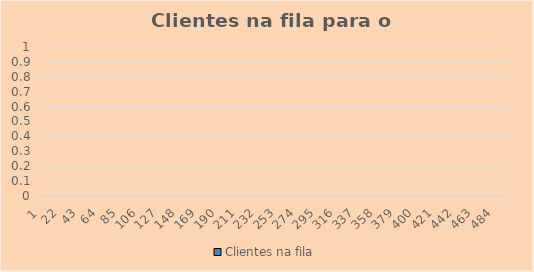
| Category | Clientes na fila |
|---|---|
| 1.0 | 0 |
| 2.0 | 0 |
| 3.0 | 0 |
| 4.0 | 0 |
| 5.0 | 0 |
| 6.0 | 0 |
| 7.0 | 0 |
| 8.0 | 0 |
| 9.0 | 0 |
| 10.0 | 0 |
| 11.0 | 0 |
| 12.0 | 0 |
| 13.0 | 0 |
| 14.0 | 0 |
| 15.0 | 0 |
| 16.0 | 0 |
| 17.0 | 0 |
| 18.0 | 0 |
| 19.0 | 0 |
| 20.0 | 0 |
| 21.0 | 0 |
| 22.0 | 0 |
| 23.0 | 0 |
| 24.0 | 0 |
| 25.0 | 0 |
| 26.0 | 0 |
| 27.0 | 0 |
| 28.0 | 0 |
| 29.0 | 0 |
| 30.0 | 0 |
| 31.0 | 0 |
| 32.0 | 0 |
| 33.0 | 0 |
| 34.0 | 0 |
| 35.0 | 0 |
| 36.0 | 0 |
| 37.0 | 0 |
| 38.0 | 0 |
| 39.0 | 0 |
| 40.0 | 0 |
| 41.0 | 0 |
| 42.0 | 0 |
| 43.0 | 0 |
| 44.0 | 0 |
| 45.0 | 0 |
| 46.0 | 0 |
| 47.0 | 0 |
| 48.0 | 0 |
| 49.0 | 0 |
| 50.0 | 0 |
| 51.0 | 0 |
| 52.0 | 0 |
| 53.0 | 0 |
| 54.0 | 0 |
| 55.0 | 0 |
| 56.0 | 0 |
| 57.0 | 0 |
| 58.0 | 0 |
| 59.0 | 0 |
| 60.0 | 0 |
| 61.0 | 0 |
| 62.0 | 0 |
| 63.0 | 0 |
| 64.0 | 0 |
| 65.0 | 0 |
| 66.0 | 0 |
| 67.0 | 0 |
| 68.0 | 0 |
| 69.0 | 0 |
| 70.0 | 0 |
| 71.0 | 0 |
| 72.0 | 0 |
| 73.0 | 0 |
| 74.0 | 0 |
| 75.0 | 0 |
| 76.0 | 0 |
| 77.0 | 0 |
| 78.0 | 0 |
| 79.0 | 0 |
| 80.0 | 0 |
| 81.0 | 0 |
| 82.0 | 0 |
| 83.0 | 0 |
| 84.0 | 0 |
| 85.0 | 0 |
| 86.0 | 0 |
| 87.0 | 0 |
| 88.0 | 0 |
| 89.0 | 0 |
| 90.0 | 0 |
| 91.0 | 0 |
| 92.0 | 0 |
| 93.0 | 0 |
| 94.0 | 0 |
| 95.0 | 0 |
| 96.0 | 0 |
| 97.0 | 0 |
| 98.0 | 0 |
| 99.0 | 0 |
| 100.0 | 0 |
| 101.0 | 0 |
| 102.0 | 0 |
| 103.0 | 0 |
| 104.0 | 0 |
| 105.0 | 0 |
| 106.0 | 0 |
| 107.0 | 0 |
| 108.0 | 0 |
| 109.0 | 0 |
| 110.0 | 0 |
| 111.0 | 0 |
| 112.0 | 0 |
| 113.0 | 0 |
| 114.0 | 0 |
| 115.0 | 0 |
| 116.0 | 0 |
| 117.0 | 0 |
| 118.0 | 0 |
| 119.0 | 0 |
| 120.0 | 0 |
| 121.0 | 0 |
| 122.0 | 0 |
| 123.0 | 0 |
| 124.0 | 0 |
| 125.0 | 0 |
| 126.0 | 0 |
| 127.0 | 0 |
| 128.0 | 0 |
| 129.0 | 0 |
| 130.0 | 0 |
| 131.0 | 0 |
| 132.0 | 0 |
| 133.0 | 0 |
| 134.0 | 0 |
| 135.0 | 0 |
| 136.0 | 0 |
| 137.0 | 0 |
| 138.0 | 0 |
| 139.0 | 0 |
| 140.0 | 0 |
| 141.0 | 0 |
| 142.0 | 0 |
| 143.0 | 0 |
| 144.0 | 0 |
| 145.0 | 0 |
| 146.0 | 0 |
| 147.0 | 0 |
| 148.0 | 0 |
| 149.0 | 0 |
| 150.0 | 0 |
| 151.0 | 0 |
| 152.0 | 0 |
| 153.0 | 0 |
| 154.0 | 0 |
| 155.0 | 0 |
| 156.0 | 0 |
| 157.0 | 0 |
| 158.0 | 0 |
| 159.0 | 0 |
| 160.0 | 0 |
| 161.0 | 0 |
| 162.0 | 0 |
| 163.0 | 0 |
| 164.0 | 0 |
| 165.0 | 0 |
| 166.0 | 0 |
| 167.0 | 0 |
| 168.0 | 0 |
| 169.0 | 0 |
| 170.0 | 0 |
| 171.0 | 0 |
| 172.0 | 0 |
| 173.0 | 0 |
| 174.0 | 0 |
| 175.0 | 0 |
| 176.0 | 0 |
| 177.0 | 0 |
| 178.0 | 0 |
| 179.0 | 0 |
| 180.0 | 0 |
| 181.0 | 0 |
| 182.0 | 0 |
| 183.0 | 0 |
| 184.0 | 0 |
| 185.0 | 0 |
| 186.0 | 0 |
| 187.0 | 0 |
| 188.0 | 0 |
| 189.0 | 0 |
| 190.0 | 0 |
| 191.0 | 0 |
| 192.0 | 0 |
| 193.0 | 0 |
| 194.0 | 0 |
| 195.0 | 0 |
| 196.0 | 0 |
| 197.0 | 0 |
| 198.0 | 0 |
| 199.0 | 0 |
| 200.0 | 0 |
| 201.0 | 0 |
| 202.0 | 0 |
| 203.0 | 0 |
| 204.0 | 0 |
| 205.0 | 0 |
| 206.0 | 0 |
| 207.0 | 0 |
| 208.0 | 0 |
| 209.0 | 0 |
| 210.0 | 0 |
| 211.0 | 0 |
| 212.0 | 0 |
| 213.0 | 0 |
| 214.0 | 0 |
| 215.0 | 0 |
| 216.0 | 0 |
| 217.0 | 0 |
| 218.0 | 0 |
| 219.0 | 0 |
| 220.0 | 0 |
| 221.0 | 0 |
| 222.0 | 0 |
| 223.0 | 0 |
| 224.0 | 0 |
| 225.0 | 0 |
| 226.0 | 0 |
| 227.0 | 0 |
| 228.0 | 0 |
| 229.0 | 0 |
| 230.0 | 0 |
| 231.0 | 0 |
| 232.0 | 0 |
| 233.0 | 0 |
| 234.0 | 0 |
| 235.0 | 0 |
| 236.0 | 0 |
| 237.0 | 0 |
| 238.0 | 0 |
| 239.0 | 0 |
| 240.0 | 0 |
| 241.0 | 0 |
| 242.0 | 0 |
| 243.0 | 0 |
| 244.0 | 0 |
| 245.0 | 0 |
| 246.0 | 0 |
| 247.0 | 0 |
| 248.0 | 0 |
| 249.0 | 0 |
| 250.0 | 0 |
| 251.0 | 0 |
| 252.0 | 0 |
| 253.0 | 0 |
| 254.0 | 0 |
| 255.0 | 0 |
| 256.0 | 0 |
| 257.0 | 0 |
| 258.0 | 0 |
| 259.0 | 0 |
| 260.0 | 0 |
| 261.0 | 0 |
| 262.0 | 0 |
| 263.0 | 0 |
| 264.0 | 0 |
| 265.0 | 0 |
| 266.0 | 0 |
| 267.0 | 0 |
| 268.0 | 0 |
| 269.0 | 0 |
| 270.0 | 0 |
| 271.0 | 0 |
| 272.0 | 0 |
| 273.0 | 0 |
| 274.0 | 0 |
| 275.0 | 0 |
| 276.0 | 0 |
| 277.0 | 0 |
| 278.0 | 0 |
| 279.0 | 0 |
| 280.0 | 0 |
| 281.0 | 0 |
| 282.0 | 0 |
| 283.0 | 0 |
| 284.0 | 0 |
| 285.0 | 0 |
| 286.0 | 0 |
| 287.0 | 0 |
| 288.0 | 0 |
| 289.0 | 0 |
| 290.0 | 0 |
| 291.0 | 0 |
| 292.0 | 0 |
| 293.0 | 0 |
| 294.0 | 0 |
| 295.0 | 0 |
| 296.0 | 0 |
| 297.0 | 0 |
| 298.0 | 0 |
| 299.0 | 0 |
| 300.0 | 0 |
| 301.0 | 0 |
| 302.0 | 0 |
| 303.0 | 0 |
| 304.0 | 0 |
| 305.0 | 0 |
| 306.0 | 0 |
| 307.0 | 0 |
| 308.0 | 0 |
| 309.0 | 0 |
| 310.0 | 0 |
| 311.0 | 0 |
| 312.0 | 0 |
| 313.0 | 0 |
| 314.0 | 0 |
| 315.0 | 0 |
| 316.0 | 0 |
| 317.0 | 0 |
| 318.0 | 0 |
| 319.0 | 0 |
| 320.0 | 0 |
| 321.0 | 0 |
| 322.0 | 0 |
| 323.0 | 0 |
| 324.0 | 0 |
| 325.0 | 0 |
| 326.0 | 0 |
| 327.0 | 0 |
| 328.0 | 0 |
| 329.0 | 0 |
| 330.0 | 0 |
| 331.0 | 0 |
| 332.0 | 0 |
| 333.0 | 0 |
| 334.0 | 0 |
| 335.0 | 0 |
| 336.0 | 0 |
| 337.0 | 0 |
| 338.0 | 0 |
| 339.0 | 0 |
| 340.0 | 0 |
| 341.0 | 0 |
| 342.0 | 0 |
| 343.0 | 0 |
| 344.0 | 0 |
| 345.0 | 0 |
| 346.0 | 0 |
| 347.0 | 0 |
| 348.0 | 0 |
| 349.0 | 0 |
| 350.0 | 0 |
| 351.0 | 0 |
| 352.0 | 0 |
| 353.0 | 0 |
| 354.0 | 0 |
| 355.0 | 0 |
| 356.0 | 0 |
| 357.0 | 0 |
| 358.0 | 0 |
| 359.0 | 0 |
| 360.0 | 0 |
| 361.0 | 0 |
| 362.0 | 0 |
| 363.0 | 0 |
| 364.0 | 0 |
| 365.0 | 0 |
| 366.0 | 0 |
| 367.0 | 0 |
| 368.0 | 0 |
| 369.0 | 0 |
| 370.0 | 0 |
| 371.0 | 0 |
| 372.0 | 0 |
| 373.0 | 0 |
| 374.0 | 0 |
| 375.0 | 0 |
| 376.0 | 0 |
| 377.0 | 0 |
| 378.0 | 0 |
| 379.0 | 0 |
| 380.0 | 0 |
| 381.0 | 0 |
| 382.0 | 0 |
| 383.0 | 0 |
| 384.0 | 0 |
| 385.0 | 0 |
| 386.0 | 0 |
| 387.0 | 0 |
| 388.0 | 0 |
| 389.0 | 0 |
| 390.0 | 0 |
| 391.0 | 0 |
| 392.0 | 0 |
| 393.0 | 0 |
| 394.0 | 0 |
| 395.0 | 0 |
| 396.0 | 0 |
| 397.0 | 0 |
| 398.0 | 0 |
| 399.0 | 0 |
| 400.0 | 0 |
| 401.0 | 0 |
| 402.0 | 0 |
| 403.0 | 0 |
| 404.0 | 0 |
| 405.0 | 0 |
| 406.0 | 0 |
| 407.0 | 0 |
| 408.0 | 0 |
| 409.0 | 0 |
| 410.0 | 0 |
| 411.0 | 0 |
| 412.0 | 0 |
| 413.0 | 0 |
| 414.0 | 0 |
| 415.0 | 0 |
| 416.0 | 0 |
| 417.0 | 0 |
| 418.0 | 0 |
| 419.0 | 0 |
| 420.0 | 0 |
| 421.0 | 0 |
| 422.0 | 0 |
| 423.0 | 0 |
| 424.0 | 0 |
| 425.0 | 0 |
| 426.0 | 0 |
| 427.0 | 0 |
| 428.0 | 0 |
| 429.0 | 0 |
| 430.0 | 0 |
| 431.0 | 0 |
| 432.0 | 0 |
| 433.0 | 0 |
| 434.0 | 0 |
| 435.0 | 0 |
| 436.0 | 0 |
| 437.0 | 0 |
| 438.0 | 0 |
| 439.0 | 0 |
| 440.0 | 0 |
| 441.0 | 0 |
| 442.0 | 0 |
| 443.0 | 0 |
| 444.0 | 0 |
| 445.0 | 0 |
| 446.0 | 0 |
| 447.0 | 0 |
| 448.0 | 0 |
| 449.0 | 0 |
| 450.0 | 0 |
| 451.0 | 0 |
| 452.0 | 0 |
| 453.0 | 0 |
| 454.0 | 0 |
| 455.0 | 0 |
| 456.0 | 0 |
| 457.0 | 0 |
| 458.0 | 0 |
| 459.0 | 0 |
| 460.0 | 0 |
| 461.0 | 0 |
| 462.0 | 0 |
| 463.0 | 0 |
| 464.0 | 0 |
| 465.0 | 0 |
| 466.0 | 0 |
| 467.0 | 0 |
| 468.0 | 0 |
| 469.0 | 0 |
| 470.0 | 0 |
| 471.0 | 0 |
| 472.0 | 0 |
| 473.0 | 0 |
| 474.0 | 0 |
| 475.0 | 0 |
| 476.0 | 0 |
| 477.0 | 0 |
| 478.0 | 0 |
| 479.0 | 0 |
| 480.0 | 0 |
| 481.0 | 0 |
| 482.0 | 0 |
| 483.0 | 0 |
| 484.0 | 0 |
| 485.0 | 0 |
| 486.0 | 0 |
| 487.0 | 0 |
| 488.0 | 0 |
| 489.0 | 0 |
| 490.0 | 0 |
| 491.0 | 0 |
| 492.0 | 0 |
| 493.0 | 0 |
| 494.0 | 0 |
| 495.0 | 0 |
| 496.0 | 0 |
| 497.0 | 0 |
| 498.0 | 0 |
| 499.0 | 0 |
| 500.0 | 0 |